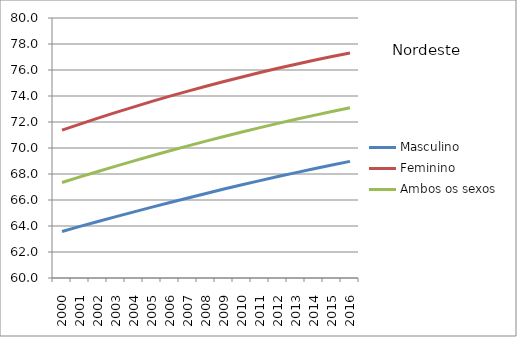
| Category | Masculino | Feminino | Ambos os sexos |
|---|---|---|---|
| 2000.0 | 63.575 | 71.377 | 67.346 |
| 2001.0 | 63.968 | 71.841 | 67.776 |
| 2002.0 | 64.349 | 72.298 | 68.197 |
| 2003.0 | 64.723 | 72.738 | 68.607 |
| 2004.0 | 65.09 | 73.168 | 69.009 |
| 2005.0 | 65.451 | 73.586 | 69.404 |
| 2006.0 | 65.809 | 73.987 | 69.788 |
| 2007.0 | 66.16 | 74.377 | 70.165 |
| 2008.0 | 66.505 | 74.753 | 70.532 |
| 2009.0 | 66.841 | 75.116 | 70.889 |
| 2010.0 | 67.167 | 75.468 | 71.234 |
| 2011.0 | 67.491 | 75.804 | 71.569 |
| 2012.0 | 67.803 | 76.131 | 71.894 |
| 2013.0 | 68.108 | 76.445 | 72.208 |
| 2014.0 | 68.403 | 76.746 | 72.511 |
| 2015.0 | 68.692 | 77.034 | 72.805 |
| 2016.0 | 68.973 | 77.312 | 73.09 |